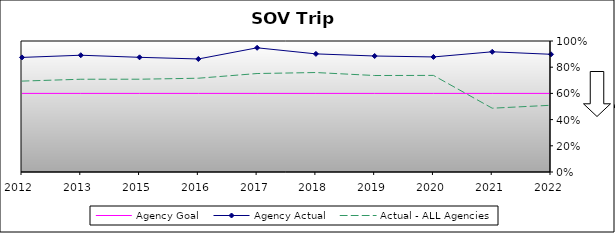
| Category | Agency Goal | Agency Actual | Actual - ALL Agencies |
|---|---|---|---|
| 2012.0 | 0.6 | 0.875 | 0.694 |
| 2013.0 | 0.6 | 0.891 | 0.708 |
| 2015.0 | 0.6 | 0.875 | 0.708 |
| 2016.0 | 0.6 | 0.863 | 0.716 |
| 2017.0 | 0.6 | 0.948 | 0.752 |
| 2018.0 | 0.6 | 0.902 | 0.759 |
| 2019.0 | 0.6 | 0.885 | 0.736 |
| 2020.0 | 0.6 | 0.878 | 0.737 |
| 2021.0 | 0.6 | 0.918 | 0.487 |
| 2022.0 | 0.6 | 0.898 | 0.509 |